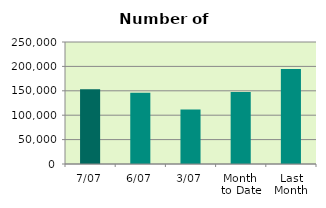
| Category | Series 0 |
|---|---|
| 7/07 | 153234 |
| 6/07 | 146008 |
| 3/07 | 111444 |
| Month 
to Date | 147676 |
| Last
Month | 194460.727 |